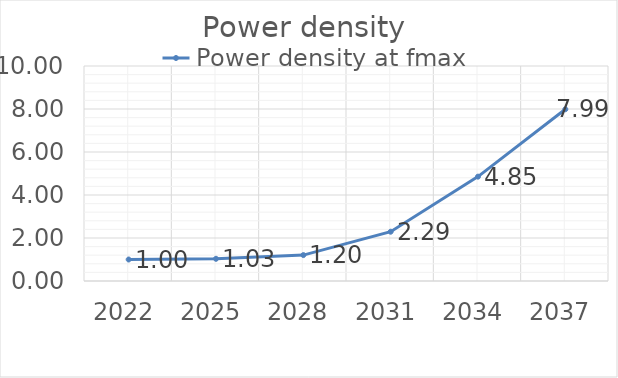
| Category | Power density at fmax |
|---|---|
| 2022.0 | 1 |
| 2025.0 | 1.033 |
| 2028.0 | 1.205 |
| 2031.0 | 2.292 |
| 2034.0 | 4.854 |
| 2037.0 | 7.987 |